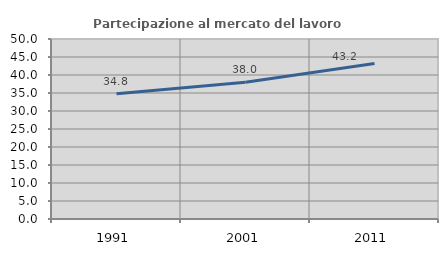
| Category | Partecipazione al mercato del lavoro  femminile |
|---|---|
| 1991.0 | 34.809 |
| 2001.0 | 37.963 |
| 2011.0 | 43.208 |